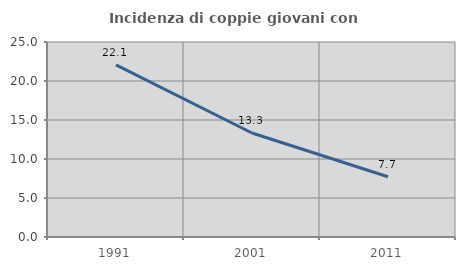
| Category | Incidenza di coppie giovani con figli |
|---|---|
| 1991.0 | 22.061 |
| 2001.0 | 13.333 |
| 2011.0 | 7.72 |